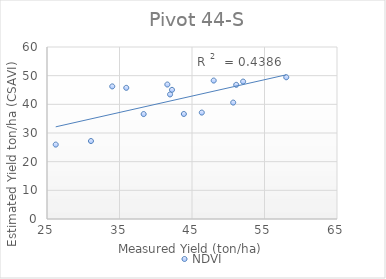
| Category | NDVI |
|---|---|
| 42.240001 | 45.05 |
| 41.599998 | 46.91 |
| 34.0 | 46.253 |
| 41.972999 | 43.451 |
| 26.202999 | 25.954 |
| 31.062999 | 27.195 |
| 52.049999 | 47.937 |
| 35.932998 | 45.75 |
| 51.099998 | 46.807 |
| 50.682998 | 40.611 |
| 46.349998 | 37.119 |
| 58.0 | 49.444 |
| 43.876998 | 36.629 |
| 38.333 | 36.598 |
| 47.993 | 48.29 |